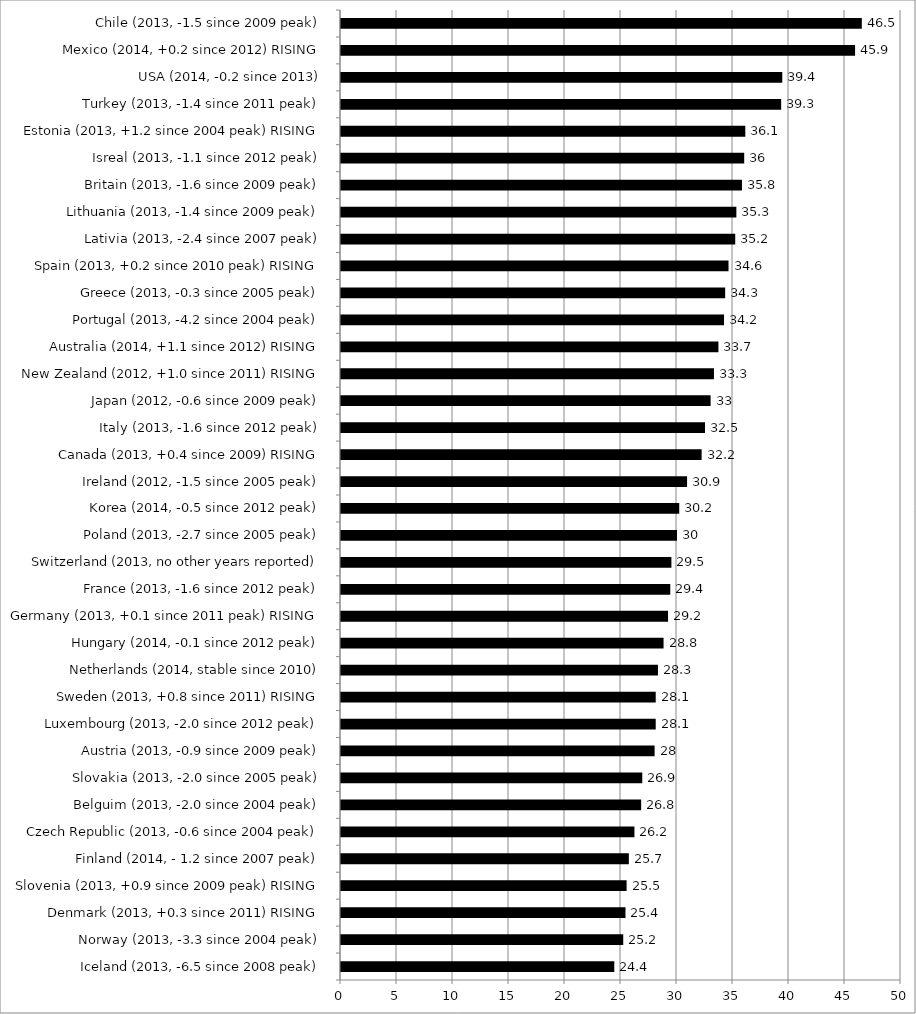
| Category | Series 0 |
|---|---|
| Iceland (2013, -6.5 since 2008 peak) | 24.4 |
| Norway (2013, -3.3 since 2004 peak) | 25.2 |
| Denmark (2013, +0.3 since 2011) RISING | 25.4 |
| Slovenia (2013, +0.9 since 2009 peak) RISING | 25.5 |
| Finland (2014, - 1.2 since 2007 peak) | 25.7 |
| Czech Republic (2013, -0.6 since 2004 peak) | 26.2 |
| Belguim (2013, -2.0 since 2004 peak) | 26.8 |
| Slovakia (2013, -2.0 since 2005 peak) | 26.9 |
| Austria (2013, -0.9 since 2009 peak) | 28 |
| Luxembourg (2013, -2.0 since 2012 peak) | 28.1 |
| Sweden (2013, +0.8 since 2011) RISING | 28.1 |
| Netherlands (2014, stable since 2010) | 28.3 |
| Hungary (2014, -0.1 since 2012 peak) | 28.8 |
| Germany (2013, +0.1 since 2011 peak) RISING | 29.2 |
| France (2013, -1.6 since 2012 peak) | 29.4 |
| Switzerland (2013, no other years reported) | 29.5 |
| Poland (2013, -2.7 since 2005 peak) | 30 |
| Korea (2014, -0.5 since 2012 peak) | 30.2 |
| Ireland (2012, -1.5 since 2005 peak) | 30.9 |
| Canada (2013, +0.4 since 2009) RISING | 32.2 |
| Italy (2013, -1.6 since 2012 peak) | 32.5 |
| Japan (2012, -0.6 since 2009 peak) | 33 |
| New Zealand (2012, +1.0 since 2011) RISING | 33.3 |
| Australia (2014, +1.1 since 2012) RISING | 33.7 |
| Portugal (2013, -4.2 since 2004 peak) | 34.2 |
| Greece (2013, -0.3 since 2005 peak) | 34.3 |
| Spain (2013, +0.2 since 2010 peak) RISING | 34.6 |
| Lativia (2013, -2.4 since 2007 peak) | 35.2 |
| Lithuania (2013, -1.4 since 2009 peak) | 35.3 |
| Britain (2013, -1.6 since 2009 peak) | 35.8 |
| Isreal (2013, -1.1 since 2012 peak) | 36 |
| Estonia (2013, +1.2 since 2004 peak) RISING | 36.1 |
| Turkey (2013, -1.4 since 2011 peak) | 39.3 |
| USA (2014, -0.2 since 2013) | 39.4 |
| Mexico (2014, +0.2 since 2012) RISING | 45.9 |
| Chile (2013, -1.5 since 2009 peak) | 46.5 |